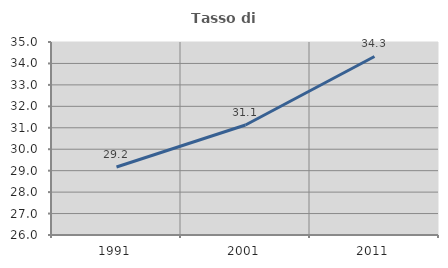
| Category | Tasso di occupazione   |
|---|---|
| 1991.0 | 29.169 |
| 2001.0 | 31.13 |
| 2011.0 | 34.325 |